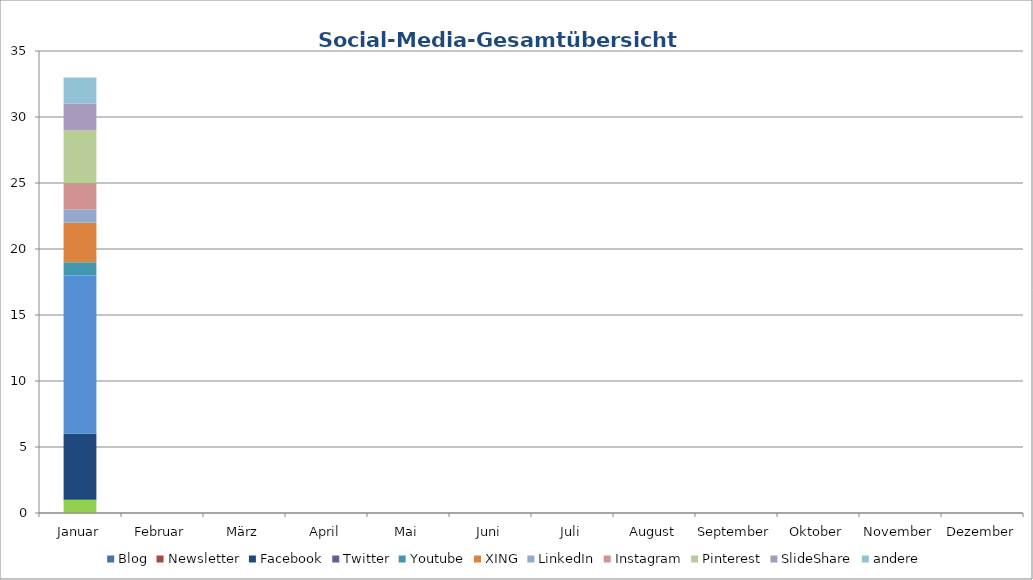
| Category | Blog | Newsletter | Facebook | Twitter | Youtube | XING | LinkedIn | Instagram | Pinterest | SlideShare | andere |
|---|---|---|---|---|---|---|---|---|---|---|---|
| Januar | 0 | 1 | 5 | 12 | 1 | 3 | 1 | 2 | 4 | 2 | 2 |
| Februar | 0 | 0 | 0 | 0 | 0 | 0 | 0 | 0 | 0 | 0 | 0 |
| März | 0 | 0 | 0 | 0 | 0 | 0 | 0 | 0 | 0 | 0 | 0 |
| April | 0 | 0 | 0 | 0 | 0 | 0 | 0 | 0 | 0 | 0 | 0 |
| Mai | 0 | 0 | 0 | 0 | 0 | 0 | 0 | 0 | 0 | 0 | 0 |
| Juni | 0 | 0 | 0 | 0 | 0 | 0 | 0 | 0 | 0 | 0 | 0 |
| Juli | 0 | 0 | 0 | 0 | 0 | 0 | 0 | 0 | 0 | 0 | 0 |
| August | 0 | 0 | 0 | 0 | 0 | 0 | 0 | 0 | 0 | 0 | 0 |
| September | 0 | 0 | 0 | 0 | 0 | 0 | 0 | 0 | 0 | 0 | 0 |
| Oktober | 0 | 0 | 0 | 0 | 0 | 0 | 0 | 0 | 0 | 0 | 0 |
| November | 0 | 0 | 0 | 0 | 0 | 0 | 0 | 0 | 0 | 0 | 0 |
| Dezember | 0 | 0 | 0 | 0 | 0 | 0 | 0 | 0 | 0 | 0 | 0 |